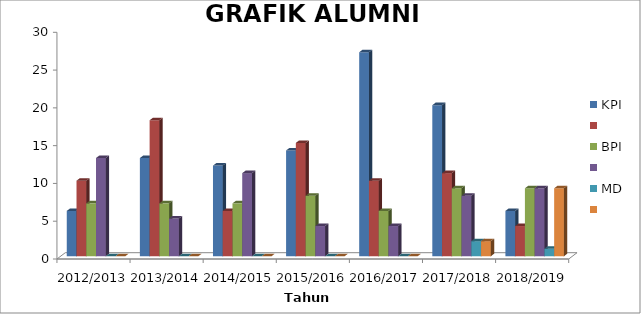
| Category | KPI | Series 1 | BPI | Series 3 | MD | Series 5 |
|---|---|---|---|---|---|---|
| 2012/2013 | 6 | 10 | 7 | 13 | 0 | 0 |
| 2013/2014 | 13 | 18 | 7 | 5 | 0 | 0 |
| 2014/2015 | 12 | 6 | 7 | 11 | 0 | 0 |
| 2015/2016 | 14 | 15 | 8 | 4 | 0 | 0 |
| 2016/2017 | 27 | 10 | 6 | 4 | 0 | 0 |
| 2017/2018 | 20 | 11 | 9 | 8 | 2 | 2 |
| 2018/2019 | 6 | 4 | 9 | 9 | 1 | 9 |